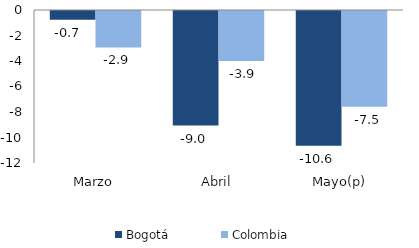
| Category | Bogotá | Colombia |
|---|---|---|
| Marzo | -0.681 | -2.855 |
| Abril | -8.988 | -3.928 |
| Mayo(p) | -10.559 | -7.503 |